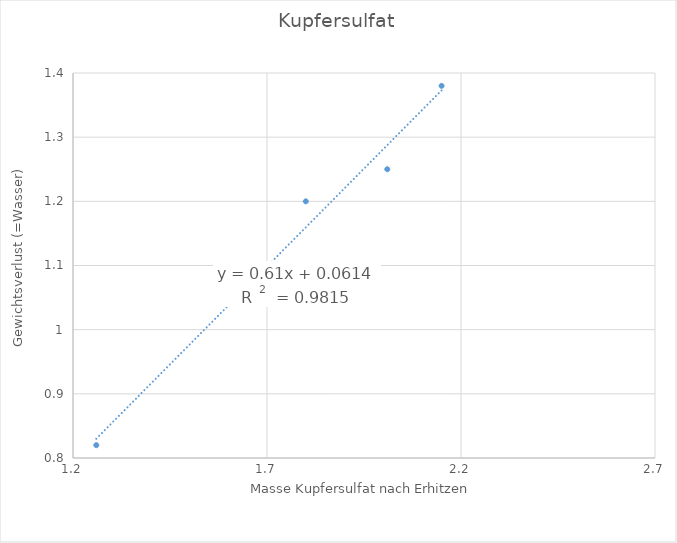
| Category | Series 0 |
|---|---|
| 1.8 | 1.2 |
| 1.26 | 0.82 |
| 2.01 | 1.25 |
| 2.15 | 1.38 |